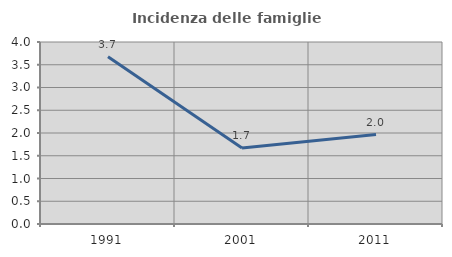
| Category | Incidenza delle famiglie numerose |
|---|---|
| 1991.0 | 3.673 |
| 2001.0 | 1.672 |
| 2011.0 | 1.966 |